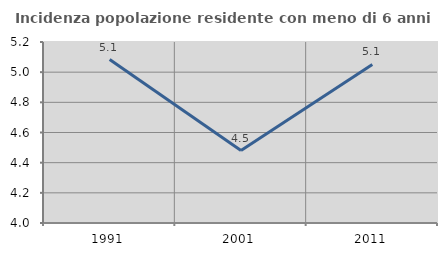
| Category | Incidenza popolazione residente con meno di 6 anni |
|---|---|
| 1991.0 | 5.084 |
| 2001.0 | 4.481 |
| 2011.0 | 5.051 |